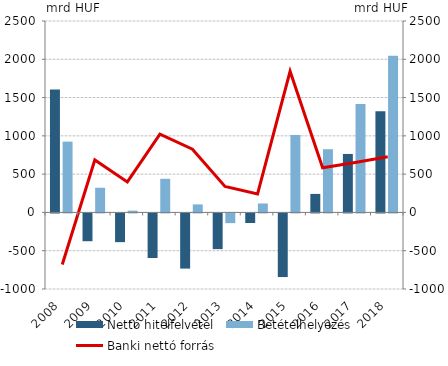
| Category | Nettó hitelfelvétel | Betételhelyezés |
|---|---|---|
| 2008.0 | 1604.117 | 924.526 |
| 2009.0 | -363.024 | 322.449 |
| 2010.0 | -375.15 | 23.517 |
| 2011.0 | -582.414 | 439.017 |
| 2012.0 | -720.502 | 104.961 |
| 2013.0 | -466.305 | -126.817 |
| 2014.0 | -125.073 | 117.279 |
| 2015.0 | -830.803 | 1012.037 |
| 2016.0 | 241.811 | 825.492 |
| 2017.0 | 763.636 | 1415.416 |
| 2018.0 | 1320.037 | 2047.136 |